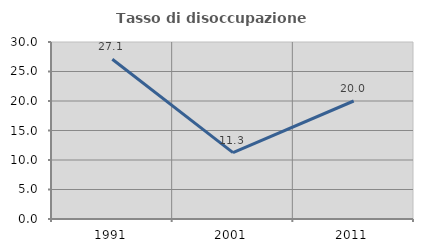
| Category | Tasso di disoccupazione giovanile  |
|---|---|
| 1991.0 | 27.068 |
| 2001.0 | 11.25 |
| 2011.0 | 20 |